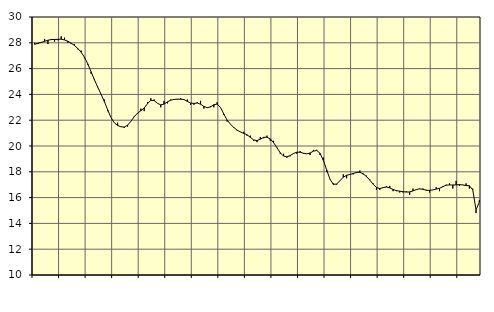
| Category | Piggar | Tillverkning o utvinning, energi o miljö, SNI 05-33, 35-39 |
|---|---|---|
| nan | 28 | 27.88 |
| 87.0 | 27.9 | 27.97 |
| 87.0 | 28 | 28.03 |
| 87.0 | 28.3 | 28.11 |
| nan | 27.9 | 28.2 |
| 88.0 | 28.3 | 28.25 |
| 88.0 | 28.1 | 28.26 |
| 88.0 | 28.2 | 28.27 |
| nan | 28.5 | 28.28 |
| 89.0 | 28.4 | 28.22 |
| 89.0 | 28 | 28.12 |
| 89.0 | 27.9 | 27.97 |
| nan | 27.9 | 27.79 |
| 90.0 | 27.5 | 27.56 |
| 90.0 | 27.4 | 27.27 |
| 90.0 | 26.8 | 26.89 |
| nan | 26.3 | 26.37 |
| 91.0 | 25.6 | 25.76 |
| 91.0 | 25.2 | 25.14 |
| 91.0 | 24.6 | 24.56 |
| nan | 24 | 24.02 |
| 92.0 | 23.6 | 23.45 |
| 92.0 | 22.7 | 22.8 |
| 92.0 | 22.2 | 22.2 |
| nan | 21.8 | 21.8 |
| 93.0 | 21.8 | 21.59 |
| 93.0 | 21.5 | 21.49 |
| 93.0 | 21.4 | 21.47 |
| nan | 21.5 | 21.61 |
| 94.0 | 21.9 | 21.91 |
| 94.0 | 22.3 | 22.27 |
| 94.0 | 22.5 | 22.55 |
| nan | 22.9 | 22.73 |
| 95.0 | 22.7 | 22.95 |
| 95.0 | 23.4 | 23.28 |
| 95.0 | 23.7 | 23.54 |
| nan | 23.6 | 23.52 |
| 96.0 | 23.3 | 23.31 |
| 96.0 | 23 | 23.19 |
| 96.0 | 23.5 | 23.25 |
| nan | 23.3 | 23.42 |
| 97.0 | 23.6 | 23.55 |
| 97.0 | 23.6 | 23.61 |
| 97.0 | 23.6 | 23.63 |
| nan | 23.7 | 23.63 |
| 98.0 | 23.6 | 23.6 |
| 98.0 | 23.6 | 23.46 |
| 98.0 | 23.2 | 23.33 |
| nan | 23.2 | 23.3 |
| 99.0 | 23.4 | 23.33 |
| 99.0 | 23.5 | 23.24 |
| 99.0 | 22.9 | 23.07 |
| nan | 23 | 22.97 |
| 0.0 | 23.1 | 23.03 |
| 0.0 | 23 | 23.2 |
| 0.0 | 23.4 | 23.25 |
| nan | 23 | 22.99 |
| 1.0 | 22.4 | 22.48 |
| 1.0 | 21.9 | 22.01 |
| 1.0 | 21.7 | 21.69 |
| nan | 21.4 | 21.44 |
| 2.0 | 21.2 | 21.23 |
| 2.0 | 21.1 | 21.09 |
| 2.0 | 21.1 | 20.98 |
| nan | 20.8 | 20.87 |
| 3.0 | 20.8 | 20.67 |
| 3.0 | 20.4 | 20.47 |
| 3.0 | 20.3 | 20.42 |
| nan | 20.7 | 20.53 |
| 4.0 | 20.6 | 20.67 |
| 4.0 | 20.8 | 20.68 |
| 4.0 | 20.4 | 20.55 |
| nan | 20.4 | 20.26 |
| 5.0 | 19.9 | 19.87 |
| 5.0 | 19.4 | 19.48 |
| 5.0 | 19.4 | 19.22 |
| nan | 19.1 | 19.16 |
| 6.0 | 19.2 | 19.26 |
| 6.0 | 19.4 | 19.42 |
| 6.0 | 19.4 | 19.52 |
| nan | 19.6 | 19.52 |
| 7.0 | 19.4 | 19.44 |
| 7.0 | 19.4 | 19.39 |
| 7.0 | 19.3 | 19.46 |
| nan | 19.7 | 19.6 |
| 8.0 | 19.7 | 19.66 |
| 8.0 | 19.3 | 19.43 |
| 8.0 | 19.1 | 18.88 |
| nan | 18 | 18.15 |
| 9.0 | 17.4 | 17.42 |
| 9.0 | 17.1 | 17.03 |
| 9.0 | 17 | 17.05 |
| nan | 17.3 | 17.31 |
| 10.0 | 17.8 | 17.58 |
| 10.0 | 17.5 | 17.73 |
| 10.0 | 17.8 | 17.79 |
| nan | 17.8 | 17.87 |
| 11.0 | 17.9 | 17.95 |
| 11.0 | 18.1 | 17.96 |
| 11.0 | 17.8 | 17.85 |
| nan | 17.7 | 17.63 |
| 12.0 | 17.4 | 17.35 |
| 12.0 | 17.1 | 17.04 |
| 12.0 | 16.6 | 16.78 |
| nan | 16.6 | 16.7 |
| 13.0 | 16.8 | 16.77 |
| 13.0 | 16.9 | 16.82 |
| 13.0 | 16.9 | 16.75 |
| nan | 16.5 | 16.63 |
| 14.0 | 16.5 | 16.54 |
| 14.0 | 16.4 | 16.5 |
| 14.0 | 16.4 | 16.46 |
| nan | 16.5 | 16.43 |
| 15.0 | 16.2 | 16.44 |
| 15.0 | 16.7 | 16.52 |
| 15.0 | 16.6 | 16.62 |
| nan | 16.7 | 16.68 |
| 16.0 | 16.7 | 16.64 |
| 16.0 | 16.6 | 16.57 |
| 16.0 | 16.4 | 16.56 |
| nan | 16.6 | 16.6 |
| 17.0 | 16.8 | 16.66 |
| 17.0 | 16.5 | 16.72 |
| 17.0 | 16.9 | 16.84 |
| nan | 17 | 16.96 |
| 18.0 | 17.1 | 16.98 |
| 18.0 | 16.7 | 16.98 |
| 18.0 | 17.3 | 16.98 |
| nan | 16.9 | 17.01 |
| 19.0 | 17 | 16.98 |
| 19.0 | 17.1 | 16.93 |
| 19.0 | 16.7 | 16.92 |
| nan | 16.7 | 16.6 |
| 20.0 | 14.8 | 15.06 |
| 20.0 | 15.8 | 15.64 |